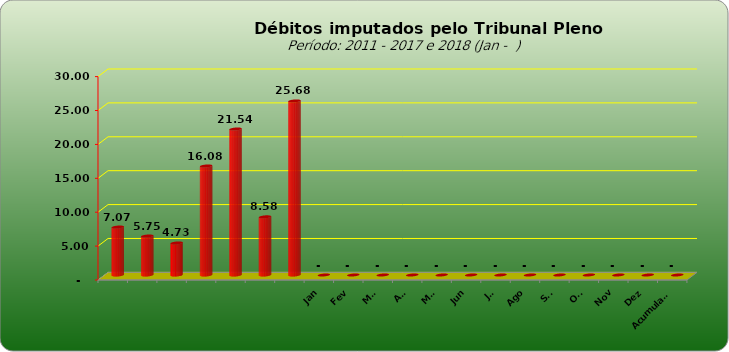
| Category |  7.073.154,74  |
|---|---|
|  | 7073154.74 |
|  | 5749129.25 |
|  | 4727033.51 |
|  | 16081820.48 |
|  | 21535723.6 |
|  | 8578266.09 |
|  | 25676499.17 |
| Jan | 0 |
| Fev | 0 |
| Mar | 0 |
| Abr | 0 |
| Mai | 0 |
| Jun | 0 |
| Jul | 0 |
| Ago | 0 |
| Set | 0 |
| Out | 0 |
| Nov | 0 |
| Dez | 0 |
| Acumulado | 0 |